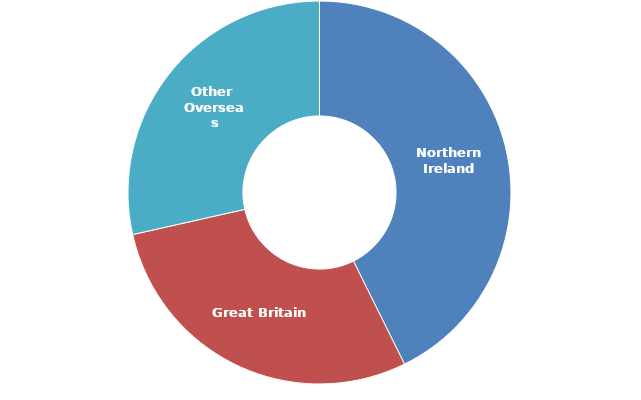
| Category | 2015 |
|---|---|
| Northern Ireland | 0.427 |
| Great Britain | 0.288 |
| Other Overseas | 0.285 |